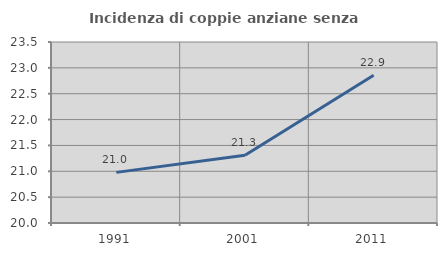
| Category | Incidenza di coppie anziane senza figli  |
|---|---|
| 1991.0 | 20.979 |
| 2001.0 | 21.311 |
| 2011.0 | 22.857 |